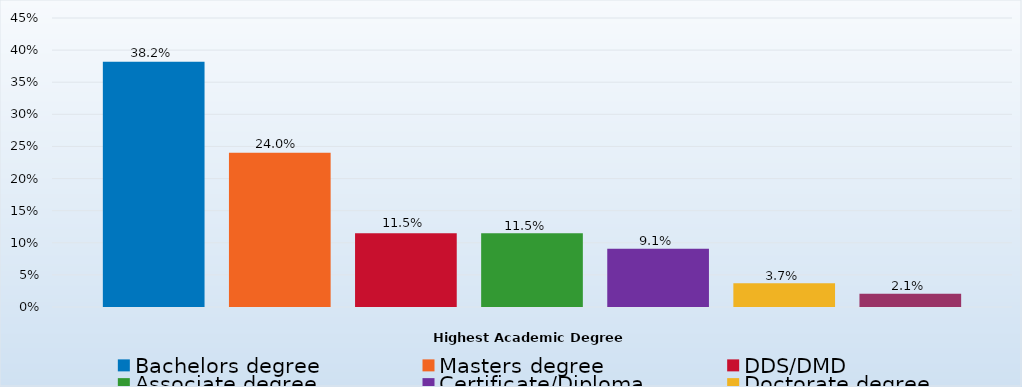
| Category | Bachelors degree | Masters degree | DDS/DMD | Associate degree | Certificate/Diploma | Doctorate degree | Other |
|---|---|---|---|---|---|---|---|
| Percent | 0.382 | 0.24 | 0.115 | 0.115 | 0.091 | 0.037 | 0.021 |